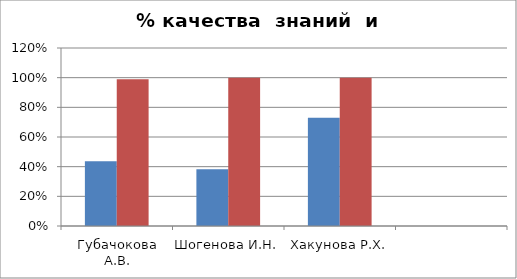
| Category | Series 0 | 2 |
|---|---|---|
| Губачокова А.В. | 0.436 | 0.989 |
| Шогенова И.Н. | 0.382 | 1 |
| Хакунова Р.Х. | 0.73 | 1 |